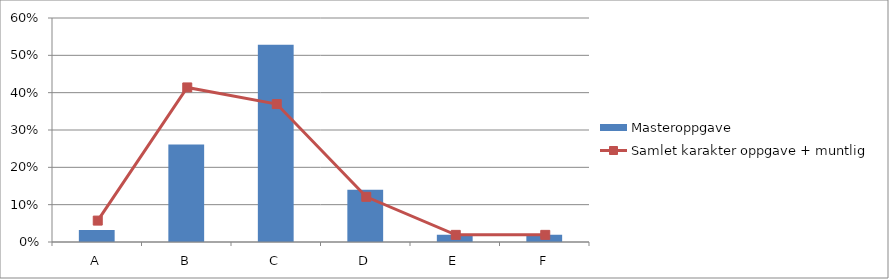
| Category | Masteroppgave |
|---|---|
| A | 0.032 |
| B | 0.261 |
| C | 0.529 |
| D | 0.14 |
| E | 0.019 |
| F | 0.019 |